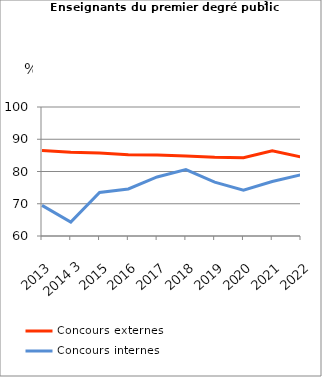
| Category | Concours externes  | Concours internes |
|---|---|---|
| 2013 | 86.5 | 69.5 |
| 2014 3 | 86 | 64.3 |
| 2015 | 85.7 | 73.5 |
| 2016 | 85.2 | 74.6 |
| 2017 | 85.1 | 78.3 |
| 2018 | 84.8 | 80.6 |
| 2019 | 84.4 | 76.7 |
| 2020 | 84.3 | 74.2 |
| 2021 | 86.4 | 76.9 |
| 2022 | 84.5 | 79 |